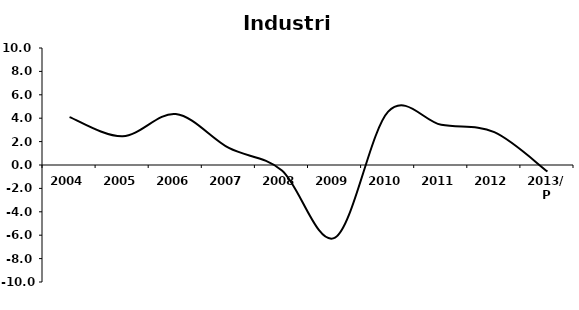
| Category | Industria |
|---|---|
| 2004 | 4.093 |
| 2005 | 2.455 |
| 2006 | 4.356 |
| 2007 | 1.454 |
| 2008 | -0.467 |
| 2009 | -6.213 |
| 2010 | 4.558 |
| 2011 | 3.434 |
| 2012 | 2.805 |
| 2013/P | -0.558 |